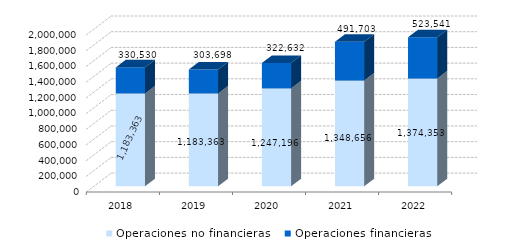
| Category | Operaciones no financieras | Operaciones financieras |
|---|---|---|
| 2018.0 | 1183363 | 330530 |
| 2019.0 | 1183362.8 | 303698.48 |
| 2020.0 | 1247196 | 322632.12 |
| 2021.0 | 1348655.89 | 491703.19 |
| 2022.0 | 1374353 | 523540.61 |